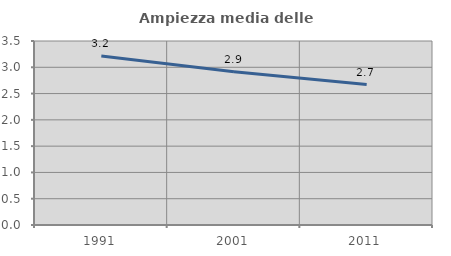
| Category | Ampiezza media delle famiglie |
|---|---|
| 1991.0 | 3.213 |
| 2001.0 | 2.916 |
| 2011.0 | 2.672 |